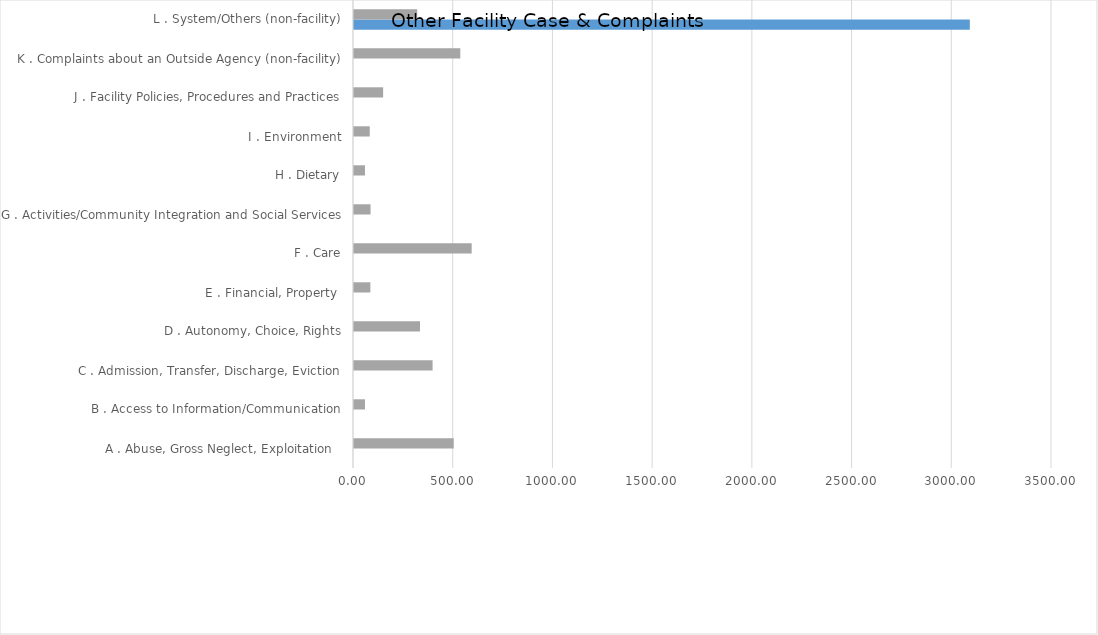
| Category | Other 
FFY 2019 | Other 
FFY 2020 |
|---|---|---|
| A . Abuse, Gross Neglect, Exploitation   | 0 | 500 |
| B . Access to Information/Communication | 0 | 55 |
| C . Admission, Transfer, Discharge, Eviction | 0 | 394 |
| D . Autonomy, Choice, Rights | 0 | 331 |
| E . Financial, Property  | 0 | 82 |
| F . Care | 0 | 590 |
| G . Activities/Community Integration and Social Services | 0 | 83 |
| H . Dietary | 0 | 55 |
| I . Environment | 0 | 79 |
| J . Facility Policies, Procedures and Practices | 0 | 146 |
| K . Complaints about an Outside Agency (non-facility) | 0 | 533 |
| L . System/Others (non-facility) | 3088 | 317 |